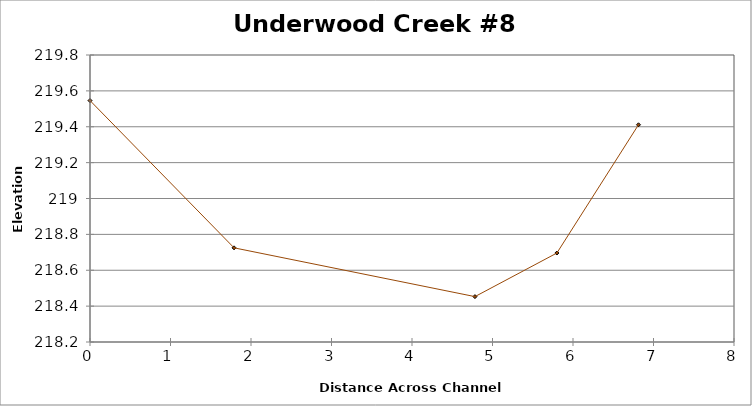
| Category | Series 0 |
|---|---|
| 0.0 | 219.546 |
| 1.7894392976973663 | 218.725 |
| 4.78200376377129 | 218.453 |
| 5.799992069375707 | 218.696 |
| 6.813565659636083 | 219.411 |